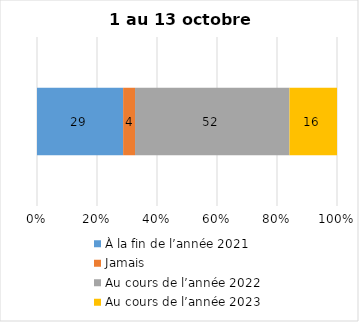
| Category | À la fin de l’année 2021 | Jamais | Au cours de l’année 2022 | Au cours de l’année 2023 |
|---|---|---|---|---|
| 0 | 29 | 4 | 52 | 16 |